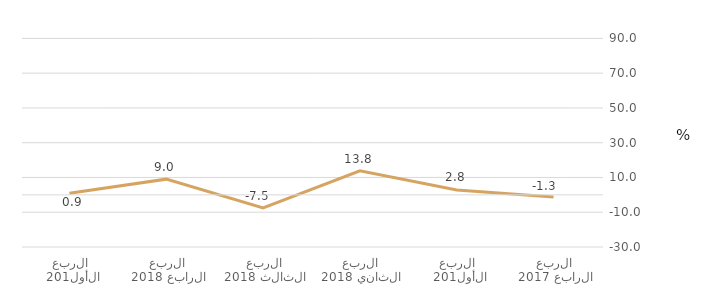
| Category | قطاع الشركات المالية |
|---|---|
| الربع الرابع 2017 | -1.298 |
| الربع الأول 2018 | 2.787 |
| الربع الثاني 2018 | 13.833 |
| الربع الثالث 2018 | -7.471 |
| الربع الرابع 2018 | 9.033 |
| الربع الأول 2019 | 0.89 |